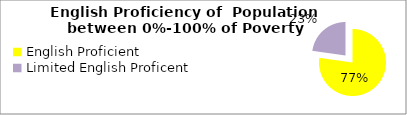
| Category | Percent |
|---|---|
| English Proficient | 0.772 |
| Limited English Proficent | 0.228 |